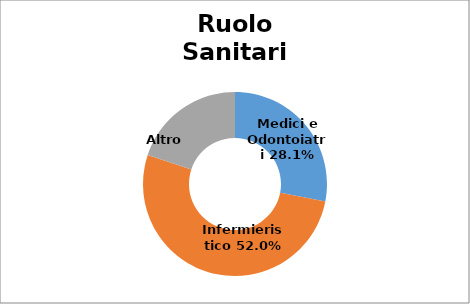
| Category | Series 0 |
|---|---|
| Medici e Odontoiatri | 0.281 |
| Infermieristico | 0.52 |
| Altro  | 0.199 |